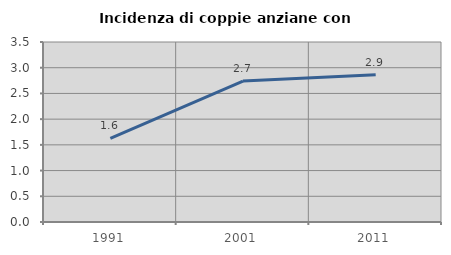
| Category | Incidenza di coppie anziane con figli |
|---|---|
| 1991.0 | 1.624 |
| 2001.0 | 2.741 |
| 2011.0 | 2.861 |